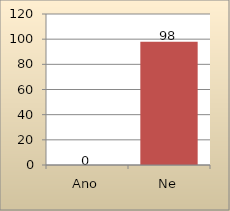
| Category | Series 0 |
|---|---|
| Ano | 0 |
| Ne | 98 |